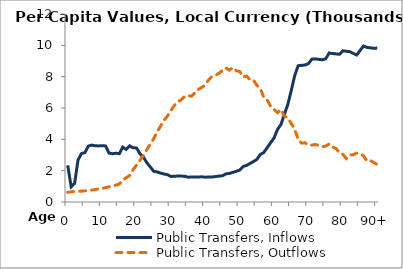
| Category | Public Transfers, Inflows | Public Transfers, Outflows |
|---|---|---|
| 0 | 2339.786 | 621.818 |
|  | 972.065 | 647.155 |
| 2 | 1182.702 | 672.491 |
| 3 | 2682.85 | 683.659 |
| 4 | 3091.121 | 691.104 |
| 5 | 3153.934 | 717.302 |
| 6 | 3571.051 | 733.071 |
| 7 | 3632.037 | 763 |
| 8 | 3586.47 | 790.338 |
| 9 | 3579.985 | 832.714 |
| 10 | 3593.844 | 870.964 |
| 11 | 3579.949 | 919.49 |
| 12 | 3125.254 | 966.84 |
| 13 | 3082.114 | 1033.069 |
| 14 | 3112.628 | 1078.257 |
| 15 | 3082.138 | 1145.758 |
| 16 | 3502.504 | 1398.326 |
| 17 | 3355.998 | 1544.469 |
| 18 | 3583.911 | 1694.876 |
| 19 | 3459.864 | 2061.983 |
| 20 | 3449.672 | 2356.303 |
| 21 | 3090.582 | 2654.376 |
| 22 | 2863.377 | 2975.929 |
| 23 | 2510.625 | 3338.232 |
| 24 | 2237.696 | 3698.281 |
| 25 | 1958.851 | 4039.442 |
| 26 | 1922.435 | 4482.049 |
| 27 | 1844.274 | 4848.828 |
| 28 | 1784.955 | 5215.923 |
| 29 | 1744.359 | 5493.521 |
| 30 | 1629.972 | 5829.405 |
| 31 | 1643.008 | 6168.735 |
| 32 | 1661.142 | 6401.527 |
| 33 | 1653.555 | 6517.197 |
| 34 | 1645.917 | 6745.115 |
| 35 | 1581.837 | 6792.861 |
| 36 | 1599.803 | 6748.209 |
| 37 | 1593.49 | 6980.002 |
| 38 | 1599.511 | 7189.691 |
| 39 | 1605.954 | 7316.799 |
| 40 | 1584.094 | 7469.467 |
| 41 | 1593.469 | 7809.259 |
| 42 | 1598.353 | 8024.334 |
| 43 | 1626.092 | 8102.767 |
| 44 | 1653.834 | 8217.715 |
| 45 | 1673.882 | 8401.906 |
| 46 | 1795.733 | 8556.213 |
| 47 | 1823.049 | 8410.816 |
| 48 | 1890.575 | 8581.235 |
| 49 | 1956.668 | 8378.311 |
| 50 | 2036.192 | 8329.98 |
| 51 | 2268.063 | 7974.487 |
| 52 | 2333.917 | 8041.826 |
| 53 | 2458.523 | 7802.788 |
| 54 | 2585.122 | 7783.482 |
| 55 | 2719.513 | 7446.445 |
| 56 | 3033.174 | 7240.778 |
| 57 | 3158.019 | 6681.441 |
| 58 | 3473.725 | 6514.099 |
| 59 | 3789.131 | 6102.728 |
| 60 | 4093.89 | 5909.449 |
| 61 | 4633.575 | 5702.89 |
| 62 | 4949.629 | 5909.208 |
| 63 | 5595.655 | 5487.016 |
| 64 | 6235.086 | 5373.234 |
| 65 | 7122.744 | 5006.377 |
| 66 | 8072.905 | 4642.231 |
| 67 | 8698.259 | 3970.238 |
| 68 | 8722.738 | 3764.127 |
| 69 | 8743.98 | 3778.697 |
| 70 | 8833.651 | 3632.944 |
| 71 | 9120.971 | 3633.365 |
| 72 | 9134.371 | 3670.519 |
| 73 | 9106.61 | 3615.465 |
| 74 | 9077.791 | 3526.939 |
| 75 | 9137.677 | 3570.08 |
| 76 | 9511.288 | 3703.259 |
| 77 | 9475.597 | 3506.968 |
| 78 | 9454.055 | 3414.809 |
| 79 | 9429.777 | 3139.592 |
| 80 | 9650.851 | 3044.183 |
| 81 | 9619.147 | 2768.073 |
| 82 | 9597.753 | 3001.919 |
| 83 | 9486.923 | 3014.444 |
| 84 | 9381.476 | 3120.191 |
| 85 | 9672.673 | 3089.595 |
| 86 | 9957.523 | 2943.337 |
| 87 | 9869.459 | 2622.795 |
| 88 | 9839.015 | 2643.14 |
| 89 | 9810.497 | 2518.058 |
| 90+ | 9827.589 | 2393.524 |